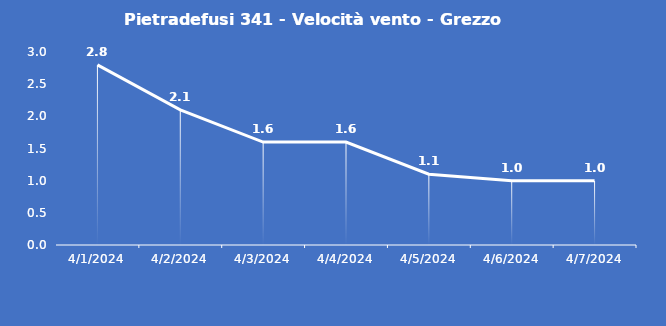
| Category | Pietradefusi 341 - Velocità vento - Grezzo (m/s) |
|---|---|
| 4/1/24 | 2.8 |
| 4/2/24 | 2.1 |
| 4/3/24 | 1.6 |
| 4/4/24 | 1.6 |
| 4/5/24 | 1.1 |
| 4/6/24 | 1 |
| 4/7/24 | 1 |